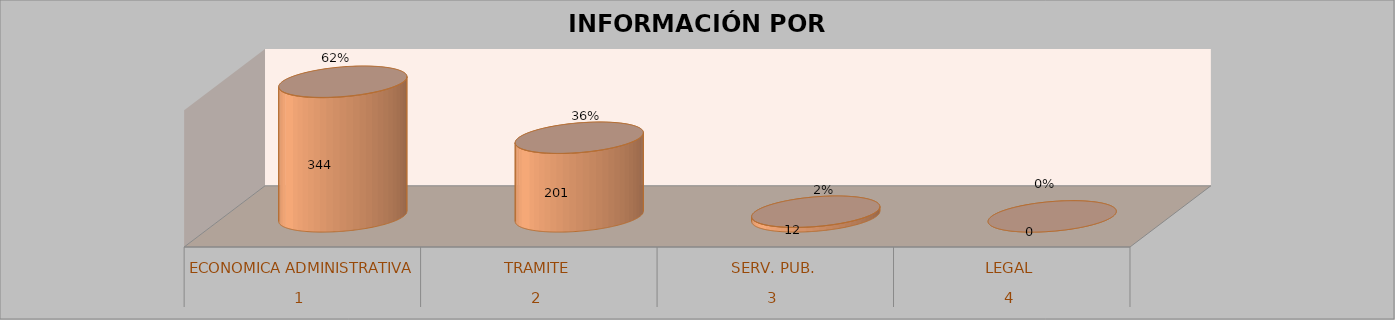
| Category | Series 0 | Series 1 | Series 2 | Series 3 |
|---|---|---|---|---|
| 0 |  |  | 344 | 0.618 |
| 1 |  |  | 201 | 0.361 |
| 2 |  |  | 12 | 0.022 |
| 3 |  |  | 0 | 0 |